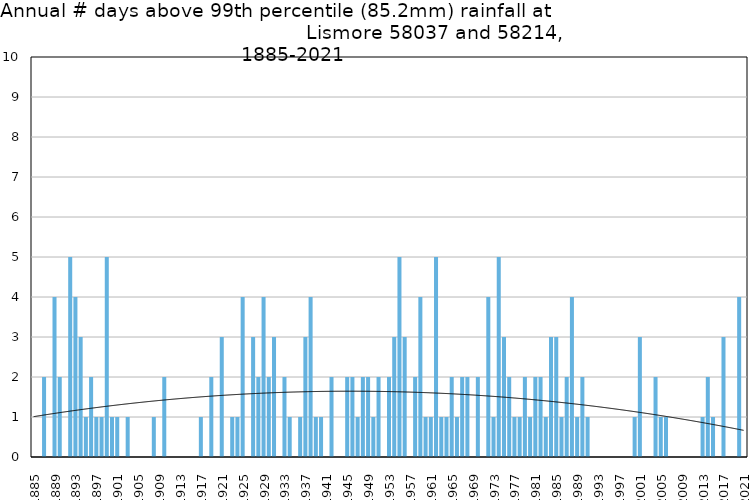
| Category | Annual # days above 99th percentile |
|---|---|
| 1885 | 0 |
| 1886 | 0 |
| 1887 | 2 |
| 1888 | 0 |
| 1889 | 4 |
| 1890 | 2 |
| 1891 | 0 |
| 1892 | 5 |
| 1893 | 4 |
| 1894 | 3 |
| 1895 | 1 |
| 1896 | 2 |
| 1897 | 1 |
| 1898 | 1 |
| 1899 | 5 |
| 1900 | 1 |
| 1901 | 1 |
| 1902 | 0 |
| 1903 | 1 |
| 1904 | 0 |
| 1905 | 0 |
| 1906 | 0 |
| 1907 | 0 |
| 1908 | 1 |
| 1909 | 0 |
| 1910 | 2 |
| 1911 | 0 |
| 1912 | 0 |
| 1913 | 0 |
| 1914 | 0 |
| 1915 | 0 |
| 1916 | 0 |
| 1917 | 1 |
| 1918 | 0 |
| 1919 | 2 |
| 1920 | 0 |
| 1921 | 3 |
| 1922 | 0 |
| 1923 | 1 |
| 1924 | 1 |
| 1925 | 4 |
| 1926 | 0 |
| 1927 | 3 |
| 1928 | 2 |
| 1929 | 4 |
| 1930 | 2 |
| 1931 | 3 |
| 1932 | 0 |
| 1933 | 2 |
| 1934 | 1 |
| 1935 | 0 |
| 1936 | 1 |
| 1937 | 3 |
| 1938 | 4 |
| 1939 | 1 |
| 1940 | 1 |
| 1941 | 0 |
| 1942 | 2 |
| 1943 | 0 |
| 1944 | 0 |
| 1945 | 2 |
| 1946 | 2 |
| 1947 | 1 |
| 1948 | 2 |
| 1949 | 2 |
| 1950 | 1 |
| 1951 | 2 |
| 1952 | 0 |
| 1953 | 2 |
| 1954 | 3 |
| 1955 | 5 |
| 1956 | 3 |
| 1957 | 0 |
| 1958 | 2 |
| 1959 | 4 |
| 1960 | 1 |
| 1961 | 1 |
| 1962 | 5 |
| 1963 | 1 |
| 1964 | 1 |
| 1965 | 2 |
| 1966 | 1 |
| 1967 | 2 |
| 1968 | 2 |
| 1969 | 0 |
| 1970 | 2 |
| 1971 | 0 |
| 1972 | 4 |
| 1973 | 1 |
| 1974 | 5 |
| 1975 | 3 |
| 1976 | 2 |
| 1977 | 1 |
| 1978 | 1 |
| 1979 | 2 |
| 1980 | 1 |
| 1981 | 2 |
| 1982 | 2 |
| 1983 | 1 |
| 1984 | 3 |
| 1985 | 3 |
| 1986 | 1 |
| 1987 | 2 |
| 1988 | 4 |
| 1989 | 1 |
| 1990 | 2 |
| 1991 | 1 |
| 1992 | 0 |
| 1993 | 0 |
| 1994 | 0 |
| 1995 | 0 |
| 1996 | 0 |
| 1997 | 0 |
| 1998 | 0 |
| 1999 | 0 |
| 2000 | 1 |
| 2001 | 3 |
| 2002 | 0 |
| 2003 | 0 |
| 2004 | 2 |
| 2005 | 1 |
| 2006 | 1 |
| 2007 | 0 |
| 2008 | 0 |
| 2009 | 0 |
| 2010 | 0 |
| 2011 | 0 |
| 2012 | 0 |
| 2013 | 1 |
| 2014 | 2 |
| 2015 | 1 |
| 2016 | 0 |
| 2017 | 3 |
| 2018 | 0 |
| 2019 | 0 |
| 2020 | 4 |
| 2021 | 0 |